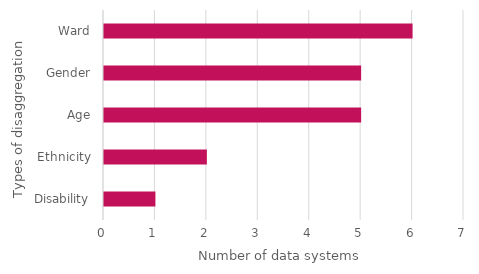
| Category | Number of data systems |
|---|---|
| Disability | 1 |
| Ethnicity | 2 |
| Age | 5 |
| Gender | 5 |
| Ward | 6 |